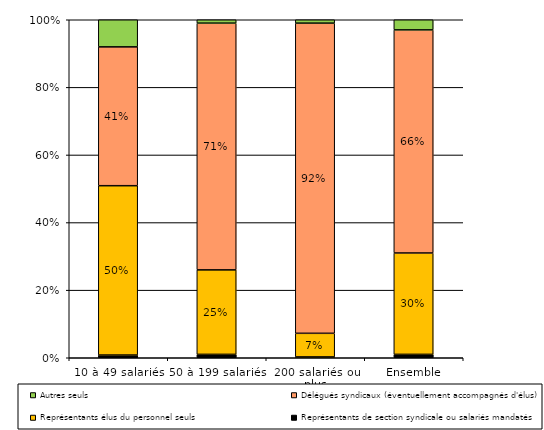
| Category | Représentants de section syndicale ou salariés mandatés | Représentants élus du personnel seuls | Délégués syndicaux (éventuellement accompagnés d'élus) | Autres seuls |
|---|---|---|---|---|
| 10 à 49 salariés | 0.008 | 0.5 | 0.41 | 0.08 |
| 50 à 199 salariés | 0.01 | 0.25 | 0.73 | 0.01 |
| 200 salariés ou plus | 0.002 | 0.07 | 0.92 | 0.01 |
| Ensemble | 0.01 | 0.3 | 0.66 | 0.03 |